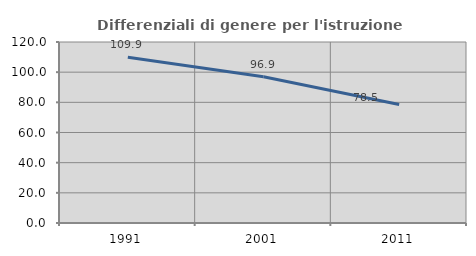
| Category | Differenziali di genere per l'istruzione superiore |
|---|---|
| 1991.0 | 109.867 |
| 2001.0 | 96.919 |
| 2011.0 | 78.508 |